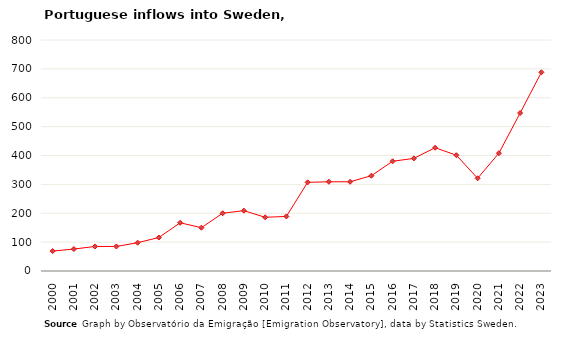
| Category | Entradas |
|---|---|
| 2000.0 | 69 |
| 2001.0 | 76 |
| 2002.0 | 85 |
| 2003.0 | 85 |
| 2004.0 | 98 |
| 2005.0 | 116 |
| 2006.0 | 167 |
| 2007.0 | 150 |
| 2008.0 | 200 |
| 2009.0 | 209 |
| 2010.0 | 186 |
| 2011.0 | 189 |
| 2012.0 | 307 |
| 2013.0 | 309 |
| 2014.0 | 309 |
| 2015.0 | 330 |
| 2016.0 | 380 |
| 2017.0 | 390 |
| 2018.0 | 427 |
| 2019.0 | 401 |
| 2020.0 | 321 |
| 2021.0 | 408 |
| 2022.0 | 547 |
| 2023.0 | 688 |